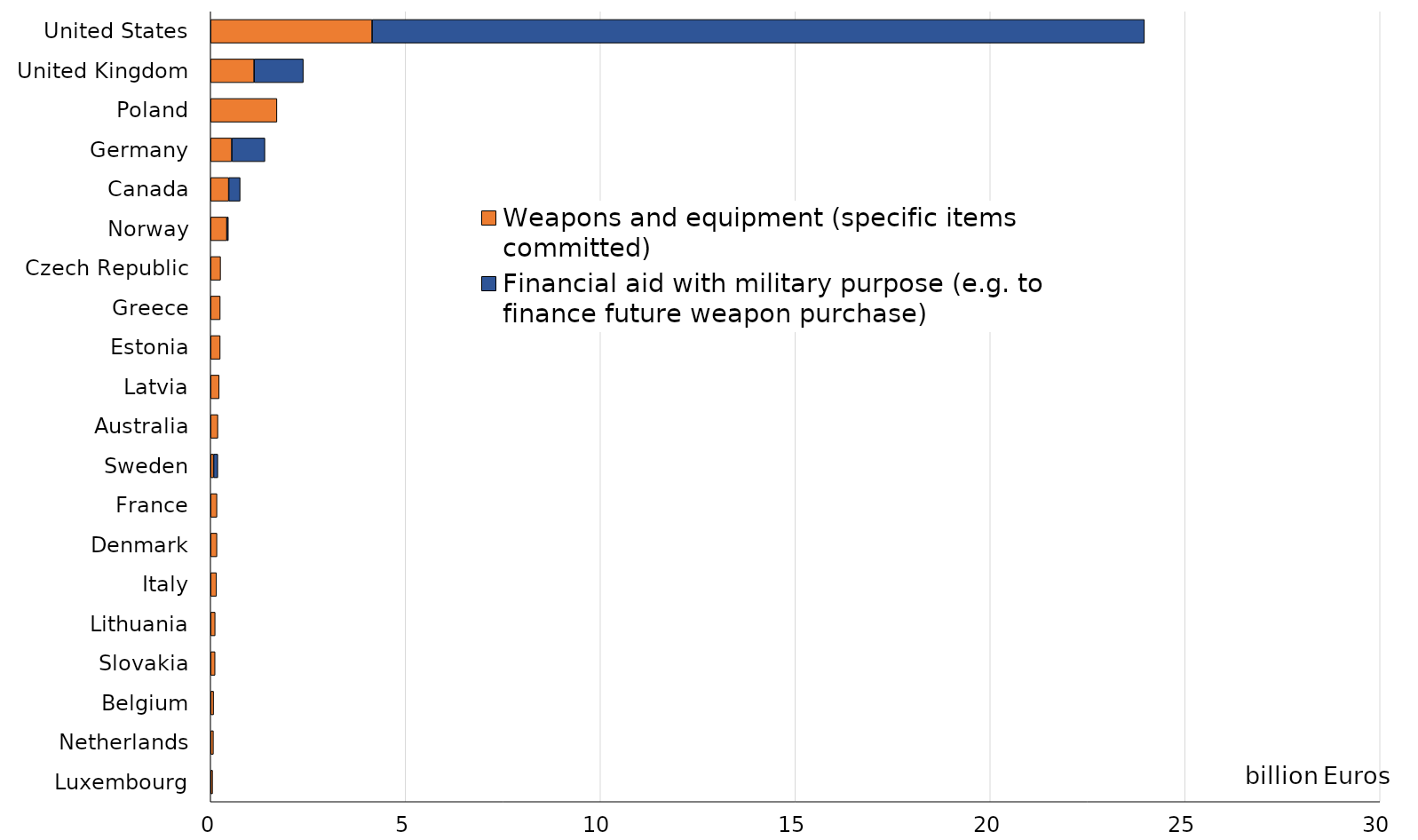
| Category | Weapons and equipment (specific items committed) | Financial aid with military purpose (e.g. to finance future weapon purchase) |
|---|---|---|
| United States | 4.142 | 19.814 |
| United Kingdom | 1.114 | 1.263 |
| Poland | 1.7 | 0 |
| Germany | 0.542 | 0.85 |
| Canada | 0.464 | 0.293 |
| Norway | 0.415 | 0.039 |
| Czech Republic | 0.255 | 0 |
| Greece | 0.246 | 0 |
| Estonia | 0.245 | 0 |
| Latvia | 0.219 | 0 |
| Australia | 0.186 | 0 |
| Sweden | 0.076 | 0.108 |
| France | 0.162 | 0 |
| Denmark | 0.162 | 0 |
| Italy | 0.15 | 0 |
| Lithuania | 0.115 | 0 |
| Slovakia | 0.113 | 0 |
| Belgium | 0.076 | 0 |
| Netherlands | 0.071 | 0 |
| Luxembourg | 0.05 | 0 |